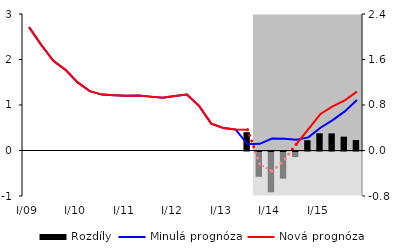
| Category | Rozdíly |
|---|---|
| 0 | 0 |
| 1 | 0 |
| 2 | 0 |
| 3 | 0 |
| 4 | 0 |
| 5 | 0 |
| 6 | 0 |
| 7 | 0 |
| 8 | 0 |
| 9 | 0 |
| 10 | 0 |
| 11 | 0 |
| 12 | 0 |
| 13 | 0 |
| 14 | 0 |
| 15 | 0 |
| 16 | 0 |
| 17 | 0 |
| 18 | 0.322 |
| 19 | -0.445 |
| 20 | -0.717 |
| 21 | -0.477 |
| 22 | -0.1 |
| 23 | 0.181 |
| 24 | 0.302 |
| 25 | 0.301 |
| 26 | 0.244 |
| 27 | 0.183 |